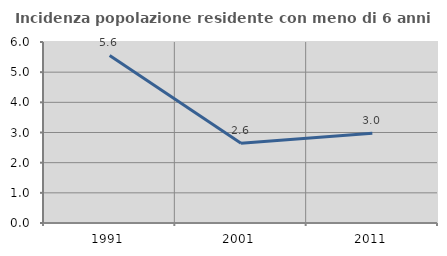
| Category | Incidenza popolazione residente con meno di 6 anni |
|---|---|
| 1991.0 | 5.556 |
| 2001.0 | 2.642 |
| 2011.0 | 2.979 |